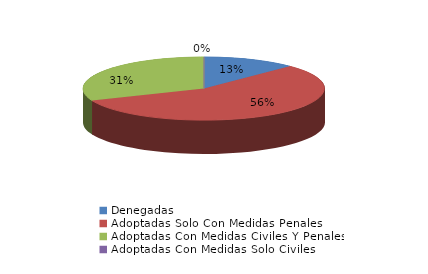
| Category | Series 0 |
|---|---|
| Denegadas | 2 |
| Adoptadas Solo Con Medidas Penales | 9 |
| Adoptadas Con Medidas Civiles Y Penales | 5 |
| Adoptadas Con Medidas Solo Civiles | 0 |